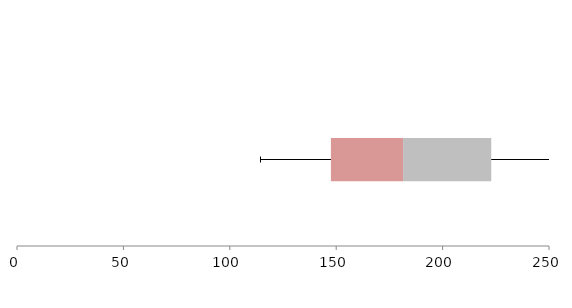
| Category | Series 1 | Series 2 | Series 3 |
|---|---|---|---|
| 0 | 147.51 | 33.918 | 41.433 |